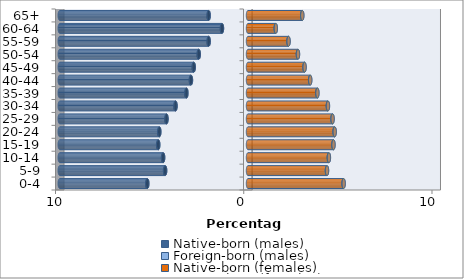
| Category | Native-born (males) | Foreign-born (males) | Native-born (females) | Foreign-born (females) |
|---|---|---|---|---|
| 0-4 | -5.349 | -0.004 | 5.077 | 0.004 |
| 5-9 | -4.402 | -0.005 | 4.194 | 0.004 |
| 10-14 | -4.508 | -0.006 | 4.294 | 0.005 |
| 15-19 | -4.767 | -0.007 | 4.536 | 0.006 |
| 20-24 | -4.711 | -0.008 | 4.6 | 0.006 |
| 25-29 | -4.329 | -0.008 | 4.488 | 0.007 |
| 30-34 | -3.85 | -0.007 | 4.242 | 0.007 |
| 35-39 | -3.271 | -0.007 | 3.681 | 0.007 |
| 40-44 | -3.031 | -0.006 | 3.3 | 0.006 |
| 45-49 | -2.882 | -0.006 | 3.001 | 0.005 |
| 50-54 | -2.616 | -0.005 | 2.651 | 0.005 |
| 55-59 | -2.089 | -0.004 | 2.15 | 0.004 |
| 60-64 | -1.383 | -0.004 | 1.474 | 0.004 |
| 65+ | -2.089 | -0.004 | 2.88 | 0.003 |